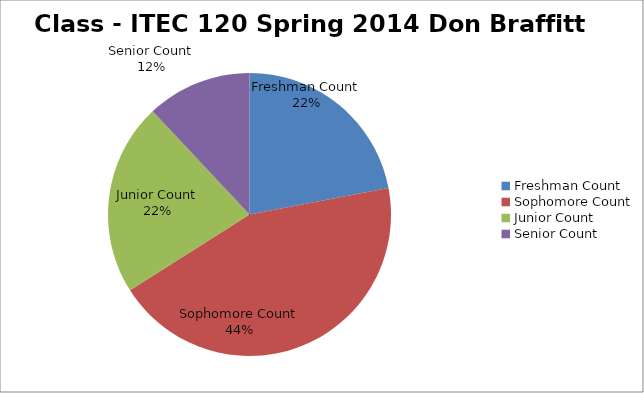
| Category | Class Freshman Freshman Freshman Freshman Freshman Freshman Freshman Freshman Freshman Freshman Freshman |
|---|---|
| Freshman Count | 11 |
| Sophomore Count | 22 |
| Junior Count | 11 |
| Senior Count | 6 |